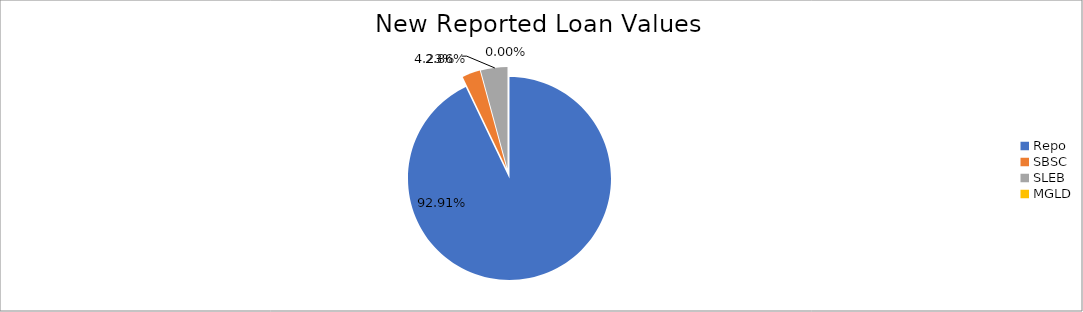
| Category | Series 0 |
|---|---|
| Repo | 8616429.393 |
| SBSC | 265081.066 |
| SLEB | 392698.708 |
| MGLD | 77.455 |